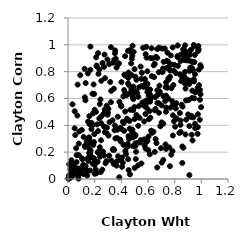
| Category | Series 0 |
|---|---|
| 0.9111496311391557 | 0.805 |
| 0.4300386188368164 | 0.641 |
| 0.11681385047252048 | 0.037 |
| 0.7985105165914542 | 0.851 |
| 0.7381791122740708 | 0.691 |
| 0.2700319630789535 | 0.39 |
| 0.3221652277435572 | 0.573 |
| 0.9387445722189655 | 0.811 |
| 0.1267107533791488 | 0.248 |
| 0.4287532225961268 | 0.503 |
| 0.6065511356872197 | 0.446 |
| 0.8351346793216523 | 0.343 |
| 0.5862582522591401 | 0.561 |
| 0.44732217881595854 | 0.241 |
| 0.4488559231616693 | 0.785 |
| 0.43003705787691354 | 0.21 |
| 0.7948076341762961 | 0.43 |
| 0.19928670790254213 | 0.103 |
| 0.8404600769013258 | 0.78 |
| 0.5054611740116359 | 0.246 |
| 0.3084729279485909 | 0.173 |
| 0.7179206851709915 | 0.873 |
| 0.5133860988383984 | 0.477 |
| 0.2487105842375922 | 0.191 |
| 0.9719962370362792 | 0.679 |
| 0.20007833114893941 | 0.039 |
| 0.5045101652680709 | 0.321 |
| 0.2913176435872602 | 0.383 |
| 0.2808524073220717 | 0.384 |
| 0.482868410909338 | 0.368 |
| 0.6689423891697657 | 0.969 |
| 0.9539236712242827 | 0.646 |
| 0.15937151676626518 | 0.31 |
| 0.9161528200462707 | 0.829 |
| 0.5359604944910391 | 0.686 |
| 0.16169019273082397 | 0.409 |
| 0.9360456858402164 | 0.869 |
| 0.21445749638043748 | 0.84 |
| 0.2226863188615661 | 0.2 |
| 0.7943998662306855 | 0.806 |
| 0.6576356980399197 | 0.298 |
| 0.4674079711340942 | 0.516 |
| 0.7402084669375346 | 0.881 |
| 0.5082239356295544 | 0.149 |
| 0.4420562838119133 | 0.449 |
| 0.27643736715558326 | 0.349 |
| 0.9926049077738904 | 0.848 |
| 0.5907746905910469 | 0.529 |
| 0.7868394595893657 | 0.475 |
| 0.3521998926847201 | 0.937 |
| 0.9303609166335965 | 0.604 |
| 0.23762078883065302 | 0.211 |
| 0.41155091159005164 | 0.121 |
| 0.6976025533912326 | 0.23 |
| 0.07478338903566999 | 0.02 |
| 0.08399607855279058 | 0.053 |
| 0.45103926048094395 | 0.147 |
| 0.4872870481964307 | 0.604 |
| 0.87690141673974 | 0.934 |
| 0.62309148330923 | 0.36 |
| 0.4894274524033153 | 0.643 |
| 0.8214296172695141 | 0.917 |
| 0.24027694764938207 | 0.189 |
| 0.04974177553686305 | 0.378 |
| 0.038212485345732704 | 0.065 |
| 0.8388338152152539 | 0.492 |
| 0.8698020250938937 | 0.765 |
| 0.5761020111148663 | 0.745 |
| 0.5542692115275305 | 0.792 |
| 0.21924962939992823 | 0.407 |
| 0.876567389653877 | 0.711 |
| 0.1176887937832676 | 0.313 |
| 0.752226267749434 | 0.749 |
| 0.07232337755618982 | 0.704 |
| 0.40321776138264415 | 0.372 |
| 0.5049398897146776 | 0.328 |
| 0.4758998143823204 | 0.668 |
| 0.740841750482692 | 0.827 |
| 0.059896144765139034 | 0.049 |
| 0.2401012145934733 | 0.166 |
| 0.026901871690102087 | 0.023 |
| 0.8786929570265387 | 0.799 |
| 0.3763799511567945 | 0.17 |
| 0.19520073622943923 | 0.154 |
| 0.7743492254205568 | 0.181 |
| 0.1631308451751773 | 0.17 |
| 0.9221726681360116 | 0.963 |
| 0.15909288980710912 | 0.193 |
| 0.4537360803392208 | 0.32 |
| 0.5712740880633747 | 0.569 |
| 0.005587227622727847 | 0.004 |
| 0.943444685102764 | 0.743 |
| 0.45970567612820423 | 0.697 |
| 0.7259544833258703 | 0.972 |
| 0.34624599378630816 | 0.217 |
| 0.9509715515077806 | 0.925 |
| 0.3493688597244169 | 0.363 |
| 0.4906103457569296 | 0.595 |
| 0.3730681676680422 | 0.464 |
| 0.48168743190293045 | 0.623 |
| 0.04883140608225112 | 0.057 |
| 0.6175114920485316 | 0.457 |
| 0.008760988786869347 | 0.109 |
| 0.9826457695010916 | 0.699 |
| 0.8123295826385284 | 0.565 |
| 0.8813455821406656 | 0.332 |
| 0.767051686571116 | 0.808 |
| 0.6187659586473282 | 0.597 |
| 0.4812705106600412 | 0.348 |
| 0.025836629642352293 | 0.14 |
| 0.941023196081663 | 0.459 |
| 0.5850044985746435 | 0.717 |
| 0.682341655697244 | 0.979 |
| 0.7825508791672247 | 0.579 |
| 0.9520491313763357 | 0.781 |
| 0.43481581343088727 | 0.186 |
| 0.023551771394068277 | 0.056 |
| 0.5130058153463005 | 0.655 |
| 0.26953783926164593 | 0.175 |
| 0.09730790284939007 | 0.058 |
| 0.663416247100233 | 0.268 |
| 0.22544022324458476 | 0.938 |
| 0.32504495027505376 | 0.138 |
| 0.19969644191872474 | 0.516 |
| 0.6857967307791488 | 0.695 |
| 0.7579993992574036 | 0.839 |
| 0.7288707246093039 | 0.582 |
| 0.9062664315511201 | 0.943 |
| 0.10367045433375191 | 0.365 |
| 0.22564465064415357 | 0.357 |
| 0.13240100288058423 | 0.715 |
| 0.671028275009286 | 0.626 |
| 0.15280136517436163 | 0.134 |
| 0.49265865009890286 | 0.947 |
| 0.39679976875938894 | 0.55 |
| 0.42828779709065523 | 0.915 |
| 0.4213157016411308 | 0.359 |
| 0.7680185431607683 | 0.532 |
| 0.9893255299276582 | 0.664 |
| 0.7900587321114094 | 0.7 |
| 0.7756833519142676 | 0.677 |
| 0.8458151306899847 | 0.351 |
| 0.3854031375389695 | 0.575 |
| 0.49882682942240414 | 0.819 |
| 0.6706159708335547 | 0.568 |
| 0.3914169937285117 | 0.293 |
| 0.9939247139479255 | 0.631 |
| 0.9340045036081808 | 0.287 |
| 0.07986537616585188 | 0.076 |
| 0.05449427400802917 | 0.327 |
| 0.39544665280635954 | 0.279 |
| 0.08032858588812802 | 0.178 |
| 0.034017297367350666 | 0.031 |
| 0.6161196408934705 | 0.577 |
| 0.1757225119408164 | 0.372 |
| 0.5257227155728047 | 0.461 |
| 0.703084193369922 | 0.802 |
| 0.07919287777658164 | 0.003 |
| 0.8744259201408906 | 0.726 |
| 0.8248153629797152 | 0.843 |
| 0.01917307968669447 | 0.011 |
| 0.6455770824102766 | 0.759 |
| 0.2753713638042745 | 0.519 |
| 0.5052301861827468 | 0.762 |
| 0.7837023749152509 | 0.208 |
| 0.018765271043172115 | 0.074 |
| 0.17653834796077228 | 0.419 |
| 0.7851836252765338 | 0.98 |
| 0.06438279124625247 | 0.126 |
| 0.8775693251550845 | 0.996 |
| 0.4494715765987105 | 0.955 |
| 0.621012419698169 | 0.607 |
| 0.859439359352633 | 0.539 |
| 0.33911390747775305 | 0.223 |
| 0.3588237063014709 | 0.896 |
| 0.8100756523471898 | 0.789 |
| 0.3640979837635689 | 0.1 |
| 0.24929612866749917 | 0.415 |
| 0.9898989873816444 | 0.591 |
| 0.41815318400173646 | 0.417 |
| 0.09179441449348216 | 0.774 |
| 0.8862998370651437 | 0.442 |
| 0.006274618011588827 | 0.026 |
| 0.9003076634861106 | 0.736 |
| 0.4507449248947203 | 0.713 |
| 0.6411268964553156 | 0.353 |
| 0.2224737885086305 | 0.129 |
| 0.7866470594573786 | 0.324 |
| 0.8487515444871679 | 0.729 |
| 0.5271780323742159 | 0.613 |
| 0.5052193867373331 | 0.265 |
| 0.06397933855268545 | 0.177 |
| 0.16632330492320033 | 0.182 |
| 0.08452118674544683 | 0.034 |
| 0.26226640652464206 | 0.205 |
| 0.0847946098456753 | 0.354 |
| 0.15685260605337195 | 0.302 |
| 0.22864330152590254 | 0.783 |
| 0.5447199334130336 | 0.838 |
| 0.8721031026799437 | 0.888 |
| 0.3163480790695066 | 0.723 |
| 0.18100616759296553 | 0.271 |
| 0.8813875304684765 | 0.674 |
| 0.59560499671388 | 0.285 |
| 0.21180969954778517 | 0.042 |
| 0.11378361409356955 | 0.106 |
| 0.48763989077746944 | 0.315 |
| 0.04029030924734762 | 0.106 |
| 0.9483932315101667 | 0.601 |
| 0.2383875103758074 | 0.558 |
| 0.0177769035114162 | 0.02 |
| 0.24978517041126838 | 0.732 |
| 0.9734767486221393 | 0.386 |
| 0.5742748563771243 | 0.25 |
| 0.6493970929622763 | 0.512 |
| 0.8646022898844322 | 0.936 |
| 0.14377879817939881 | 0.026 |
| 0.6052241117624018 | 0.619 |
| 0.30367961988089104 | 0.324 |
| 0.7597245571204744 | 0.235 |
| 0.02880479635935147 | 0.088 |
| 0.9274333788455694 | 0.33 |
| 0.49748544975427494 | 0.536 |
| 0.9104304492959125 | 0.394 |
| 0.12480412435384455 | 0.821 |
| 0.884345972348518 | 0.885 |
| 0.7888246886596952 | 0.555 |
| 0.05010787103246642 | 0.505 |
| 0.16764279642788887 | 0.814 |
| 0.6820139419356843 | 0.494 |
| 0.2919633290471828 | 0.526 |
| 0.09026721276470592 | 0.077 |
| 0.1623759204625662 | 0.222 |
| 0.6696282502788881 | 0.661 |
| 0.1872550322702444 | 0.489 |
| 0.7313012747173697 | 0.257 |
| 0.10581246622910304 | 0.154 |
| 0.7028842753028343 | 0.122 |
| 0.8755665192235897 | 0.957 |
| 0.5953209145495835 | 0.803 |
| 0.5813713028113396 | 0.227 |
| 0.9124424929485175 | 0.733 |
| 0.2455905148012621 | 0.052 |
| 0.12857854477047578 | 0.239 |
| 0.16469421912044294 | 0.194 |
| 0.34413890772122013 | 0.111 |
| 0.13245981401363427 | 0.097 |
| 0.16893580289818075 | 0.405 |
| 0.3847318346268138 | 0.013 |
| 0.005399768778397544 | 0.006 |
| 0.5952114951543013 | 0.648 |
| 0.20963372149151546 | 0.5 |
| 0.6692693612619083 | 0.086 |
| 0.15602012778356075 | 0.307 |
| 0.4701671348628871 | 0.95 |
| 0.19598799089965352 | 0.634 |
| 0.7647363527612803 | 0.096 |
| 0.21465359330388317 | 0.846 |
| 0.8445243386020784 | 0.88 |
| 0.6540157586665576 | 0.61 |
| 0.5629011547370278 | 0.977 |
| 0.6687288286755981 | 0.902 |
| 0.5101854614631756 | 0.202 |
| 0.9722113911167326 | 0.336 |
| 0.12046569035783182 | 0.093 |
| 0.4544942237458471 | 0.436 |
| 0.8435110820322342 | 0.404 |
| 0.8853584648805858 | 0.586 |
| 0.6825224080144272 | 0.564 |
| 0.8587929087278529 | 0.738 |
| 0.5579309056935479 | 0.57 |
| 0.45843683942843644 | 0.298 |
| 0.4548262540265198 | 0.066 |
| 0.4225252467339125 | 0.777 |
| 0.7749881198674418 | 0.854 |
| 0.24793985172870386 | 0.289 |
| 0.8522300430809937 | 0.554 |
| 0.9481681768329914 | 0.871 |
| 0.23520353394011623 | 0.817 |
| 0.4655884353475929 | 0.96 |
| 0.28775112618688087 | 0.134 |
| 0.15394479250881912 | 0.161 |
| 0.4698374076950021 | 0.646 |
| 0.8656013902200975 | 0.892 |
| 0.48608809437462175 | 0.245 |
| 0.27813953340355224 | 0.497 |
| 0.6564192551374263 | 0.521 |
| 0.9211280781796216 | 0.463 |
| 0.7351113801966238 | 0.224 |
| 0.18565973627333884 | 0.113 |
| 0.03576656743174452 | 0.045 |
| 0.7140524831238316 | 0.142 |
| 0.7123563891438197 | 0.823 |
| 0.3915835078948125 | 0.381 |
| 0.572785436185337 | 0.545 |
| 0.4991576149935779 | 0.446 |
| 0.41501338504348406 | 0.615 |
| 0.2573104878836541 | 0.07 |
| 0.975497208738205 | 0.954 |
| 0.07505048824209203 | 0.078 |
| 0.5724429234536887 | 0.296 |
| 0.7357865615727973 | 0.621 |
| 0.9246928957282298 | 0.471 |
| 0.25076474672907956 | 0.467 |
| 0.032419043037878584 | 0.046 |
| 0.48187682899384565 | 0.919 |
| 0.6598951664406528 | 0.911 |
| 0.48445849479543235 | 0.993 |
| 0.5893083750348156 | 0.905 |
| 0.3474435439066111 | 0.89 |
| 0.5532272836003694 | 0.693 |
| 0.5316097543098819 | 0.543 |
| 0.8039051164061431 | 0.39 |
| 0.3689651995443692 | 0.305 |
| 0.9101439839449574 | 0.029 |
| 0.4648392637384652 | 0.035 |
| 0.9044739395691748 | 0.589 |
| 0.270061186596074 | 0.836 |
| 0.8229408695928077 | 0.995 |
| 0.15349554410771482 | 0.259 |
| 0.14390503567648563 | 0.06 |
| 0.5488966629912435 | 0.746 |
| 0.24383046416597406 | 0.593 |
| 0.6040563112554095 | 0.316 |
| 0.6508364079686448 | 0.201 |
| 0.43982219121103644 | 0.624 |
| 0.04966310262180306 | 0.087 |
| 0.27410290187233943 | 0.927 |
| 0.5957477171589858 | 0.709 |
| 0.7446870081474366 | 0.68 |
| 0.9983281113827457 | 0.535 |
| 0.3222462187789793 | 0.983 |
| 0.0033294293011412778 | 0.001 |
| 0.714910455477086 | 0.413 |
| 0.1504093353605 | 0.428 |
| 0.355367555169529 | 0.302 |
| 0.13064787056418273 | 0.587 |
| 0.586735983353006 | 0.985 |
| 0.9113158379588734 | 0.95 |
| 0.26709244730732074 | 0.486 |
| 0.18480579621523677 | 0.401 |
| 0.44756895475378894 | 0.261 |
| 0.22630834394715654 | 0.196 |
| 0.4786280226514887 | 0.896 |
| 0.018032482971785987 | 0.009 |
| 0.33787486038635967 | 0.867 |
| 0.7060697262550751 | 0.972 |
| 0.16037502131211015 | 0.469 |
| 0.1923264879729971 | 0.705 |
| 0.20038170153305127 | 0.126 |
| 0.4867522747781392 | 0.31 |
| 0.4627241420024789 | 0.375 |
| 0.6306259271255792 | 0.345 |
| 0.1949009456227638 | 0.275 |
| 0.8821936961119609 | 0.913 |
| 0.6286506862018308 | 0.767 |
| 0.16090512224983794 | 0.283 |
| 0.286681341287852 | 0.508 |
| 0.6929347292016164 | 0.393 |
| 0.5180430629211012 | 0.268 |
| 0.9011662287840501 | 0.481 |
| 0.6426821930166791 | 0.847 |
| 0.12599641981854187 | 0.61 |
| 0.15379470399089712 | 0.157 |
| 0.5131117712463316 | 0.74 |
| 0.37465390498260465 | 0.854 |
| 0.14054283456926503 | 0.281 |
| 0.3998931467720705 | 0.541 |
| 0.1747782563213394 | 0.163 |
| 0.5977507389358183 | 0.672 |
| 0.734986426945574 | 0.501 |
| 0.876745084083697 | 0.945 |
| 0.4007449070588922 | 0.722 |
| 0.3716029877899251 | 0.368 |
| 0.979700926223514 | 0.964 |
| 0.8573316412036209 | 0.242 |
| 0.5370454399235391 | 0.455 |
| 0.45394097062533695 | 0.793 |
| 0.4738967054804393 | 0.861 |
| 0.23859358491156196 | 0.236 |
| 0.8639068707135346 | 0.771 |
| 0.8138201034404088 | 0.452 |
| 0.8436807504478155 | 0.435 |
| 0.3086932218356539 | 0.856 |
| 0.6131225369540642 | 0.184 |
| 0.7023348105295489 | 0.422 |
| 0.912454120501298 | 0.924 |
| 0.8570375728392539 | 0.12 |
| 0.8758664059772147 | 0.757 |
| 0.9774553042929551 | 0.991 |
| 0.7495743740632987 | 0.876 |
| 0.865034942735361 | 0.233 |
| 0.9537264373692955 | 0.378 |
| 0.7649956621461231 | 0.762 |
| 0.4916979604443851 | 0.689 |
| 0.6811073396132334 | 0.796 |
| 0.7356691292229984 | 0.719 |
| 0.03608270852264394 | 0.041 |
| 0.4048173906136502 | 0.091 |
| 0.47625937239212457 | 0.775 |
| 0.8578062022665671 | 0.755 |
| 0.8641530248449524 | 0.967 |
| 0.35236441754230796 | 0.399 |
| 0.6268535857692868 | 0.974 |
| 0.581175300786519 | 0.484 |
| 0.9448143718635422 | 0.727 |
| 0.2108953290103585 | 0.907 |
| 0.565785592942319 | 0.687 |
| 0.5849654443828796 | 0.583 |
| 0.4615039704124394 | 0.434 |
| 0.36677247139202795 | 0.132 |
| 0.32377214863305087 | 0.657 |
| 0.08092078372941008 | 0.264 |
| 0.5883249531337096 | 0.277 |
| 0.6895874910183369 | 0.639 |
| 0.5822880898928268 | 0.93 |
| 0.7529530551330442 | 0.599 |
| 0.9819272418329588 | 0.815 |
| 0.7712583499485448 | 0.921 |
| 0.4112804175875829 | 0.426 |
| 0.6507112167378887 | 0.858 |
| 0.02773641730181459 | 0.016 |
| 0.4889993871082694 | 0.513 |
| 0.616515796493571 | 0.666 |
| 0.2816249259111997 | 0.118 |
| 0.07026422702909252 | 0.473 |
| 0.16540839098030533 | 0.064 |
| 0.27766720511748205 | 0.752 |
| 0.9084023697782886 | 0.707 |
| 0.36425357014219817 | 0.83 |
| 0.9887054825920689 | 0.441 |
| 0.19769424575131037 | 0.334 |
| 0.3539325358590926 | 0.958 |
| 0.49282572233518024 | 0.339 |
| 0.7462167347315874 | 0.941 |
| 0.8082859310869005 | 0.526 |
| 0.14881359960106247 | 0.787 |
| 0.571274038467833 | 0.429 |
| 0.3335441129398718 | 0.438 |
| 0.3032125015384867 | 0.523 |
| 0.9974006501978054 | 0.834 |
| 0.18363430742967424 | 0.636 |
| 0.6176356915933481 | 0.902 |
| 0.2999215312792809 | 0.495 |
| 0.10887054275662905 | 0.146 |
| 0.38165933351763137 | 0.862 |
| 0.7092600676442516 | 0.797 |
| 0.430110738788333 | 0.77 |
| 0.29011660446067017 | 0.341 |
| 0.1260001690078417 | 0.08 |
| 0.14687657300835286 | 0.15 |
| 0.6109946080754031 | 0.506 |
| 0.009034837817281044 | 0.015 |
| 0.34373836311232236 | 0.673 |
| 0.9502455906374477 | 0.989 |
| 0.1691984412351196 | 0.212 |
| 0.6365603997770843 | 0.899 |
| 0.5269345380389276 | 0.396 |
| 0.3118973734018932 | 0.424 |
| 0.45232580642432385 | 0.753 |
| 0.7356727406360125 | 0.533 |
| 0.5239049143967517 | 0.101 |
| 0.542178785271175 | 0.273 |
| 0.5452089677619399 | 0.29 |
| 0.9746741142741795 | 0.483 |
| 0.500437027124027 | 0.082 |
| 0.9432825372587047 | 0.999 |
| 0.6158344282874106 | 0.629 |
| 0.6877340967406099 | 0.652 |
| 0.4162611949304369 | 0.254 |
| 0.3362864449615718 | 0.218 |
| 0.821634621671969 | 0.909 |
| 0.9525099290649873 | 0.411 |
| 0.8475672588649977 | 0.928 |
| 0.4209476841480431 | 0.663 |
| 0.9322516620923039 | 0.658 |
| 0.18954060682584475 | 0.254 |
| 0.7011662063030352 | 0.549 |
| 0.29689272868560607 | 0.479 |
| 0.755176393331784 | 0.741 |
| 0.20757743310728957 | 0.071 |
| 0.39520521439462836 | 0.143 |
| 0.17468199107881754 | 0.164 |
| 0.5507354822957218 | 0.116 |
| 0.7159330929798108 | 0.618 |
| 0.29037195378984204 | 0.547 |
| 0.9027061506913044 | 0.883 |
| 0.9587436592719039 | 0.65 |
| 0.5193878205955742 | 0.638 |
| 0.033479371856075545 | 0.557 |
| 0.25877538031532676 | 0.864 |
| 0.23465738655797183 | 0.451 |
| 0.9237049672002811 | 0.877 |
| 0.6020632505800014 | 0.215 |
| 0.06118012542209493 | 0.229 |
| 0.16812172353839547 | 0.987 |
| 0.7332315030795299 | 0.683 |
| 0.29604081934181636 | 0.89 |
| 0.9306601800497131 | 0.826 |
| 0.4047633806187904 | 0.16 |